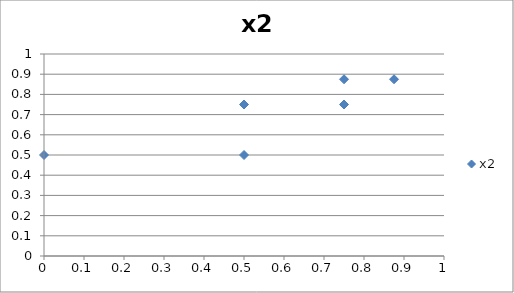
| Category | x2 |
|---|---|
| 0.0 | 0.5 |
| 0.5 | 0.5 |
| 0.5 | 0.75 |
| 0.75 | 0.75 |
| 0.75 | 0.875 |
| 0.875 | 0.875 |